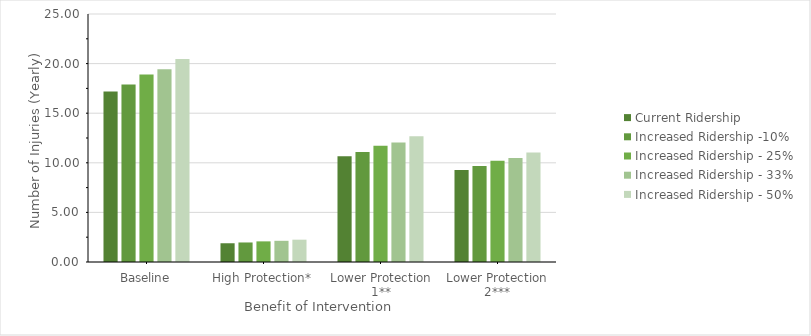
| Category | Current Ridership | Increased Ridership -10% | Increased Ridership - 25% | Increased Ridership - 33% | Increased Ridership - 50% |
|---|---|---|---|---|---|
| Baseline | 17.18 | 17.899 | 18.91 | 19.421 | 20.452 |
| High Protection* | 1.89 | 1.969 | 2.08 | 2.136 | 2.25 |
| Lower Protection 1** | 10.652 | 11.097 | 11.724 | 12.041 | 12.68 |
| Lower Protection 2*** | 9.277 | 9.665 | 10.211 | 10.487 | 11.044 |